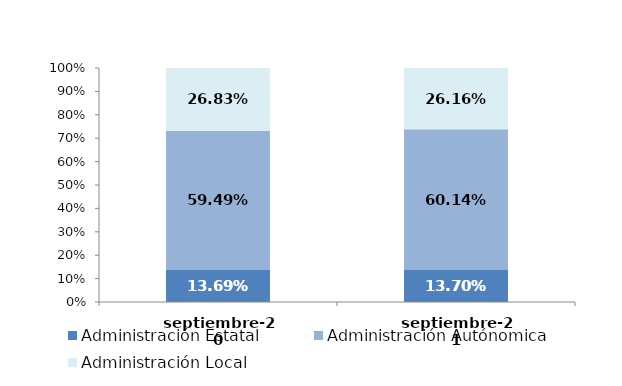
| Category | Administración Estatal | Administración Autónomica | Administración Local |
|---|---|---|---|
| 2020-09-01 | 0.137 | 0.595 | 0.268 |
| 2021-09-01 | 0.137 | 0.601 | 0.262 |